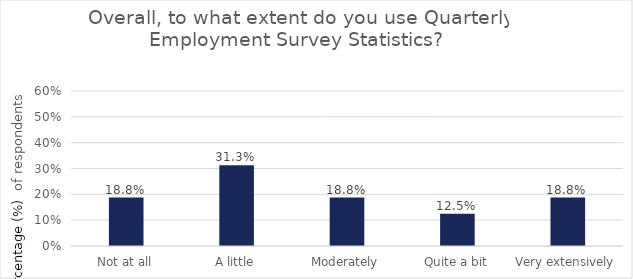
| Category | Series 0 |
|---|---|
| Not at all | 0.188 |
| A little | 0.312 |
| Moderately | 0.188 |
| Quite a bit | 0.125 |
| Very extensively | 0.188 |